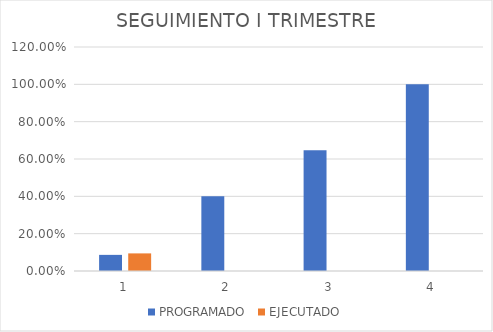
| Category | PROGRAMADO | EJECUTADO |
|---|---|---|
| 0 | 0.086 | 0.094 |
| 1 | 0.4 | 0 |
| 2 | 0.647 | 0 |
| 3 | 1 | 0 |